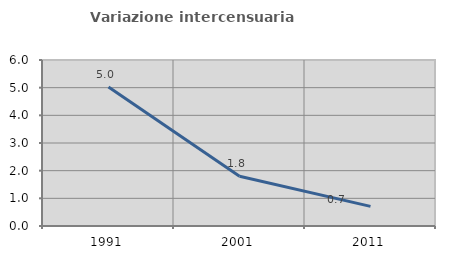
| Category | Variazione intercensuaria annua |
|---|---|
| 1991.0 | 5.021 |
| 2001.0 | 1.795 |
| 2011.0 | 0.71 |